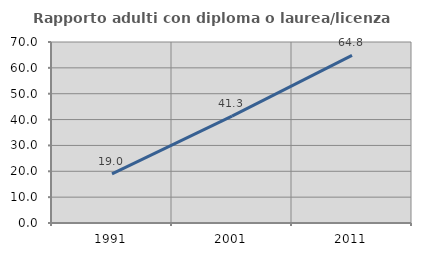
| Category | Rapporto adulti con diploma o laurea/licenza media  |
|---|---|
| 1991.0 | 19.01 |
| 2001.0 | 41.335 |
| 2011.0 | 64.795 |